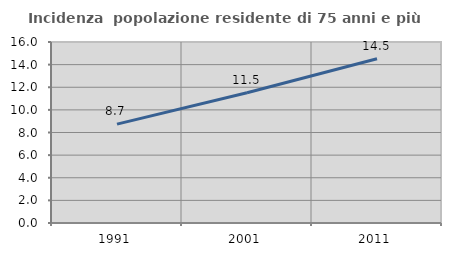
| Category | Incidenza  popolazione residente di 75 anni e più |
|---|---|
| 1991.0 | 8.738 |
| 2001.0 | 11.51 |
| 2011.0 | 14.516 |